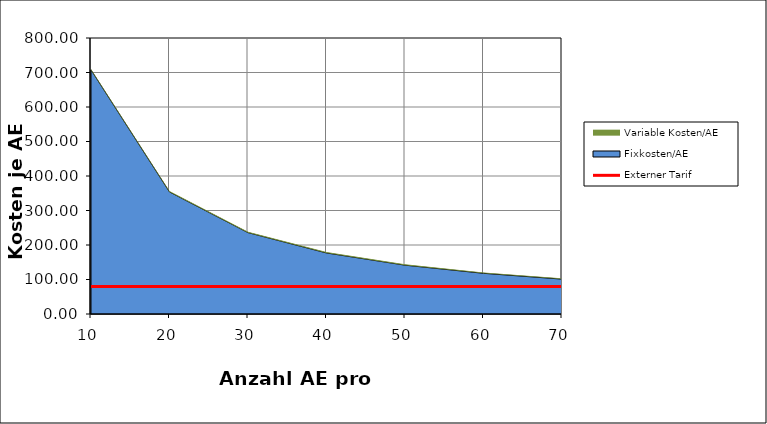
| Category | Externer Tarif |
|---|---|
| 0 | 80 |
| 1 | 80 |
| 2 | 80 |
| 3 | 80 |
| 4 | 80 |
| 5 | 80 |
| 6 | 80 |